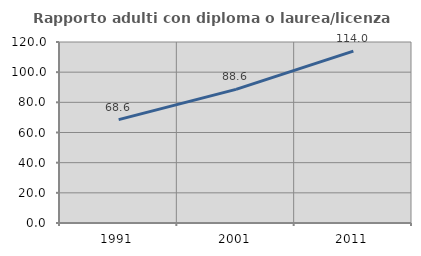
| Category | Rapporto adulti con diploma o laurea/licenza media  |
|---|---|
| 1991.0 | 68.555 |
| 2001.0 | 88.562 |
| 2011.0 | 113.974 |